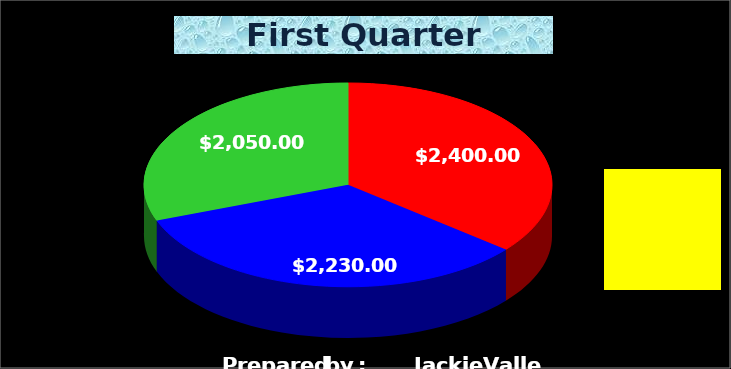
| Category | Series 0 |
|---|---|
| Balance for Jan | 2400 |
| Balance for Feb | 2230 |
| Balance for Mar | 2050 |